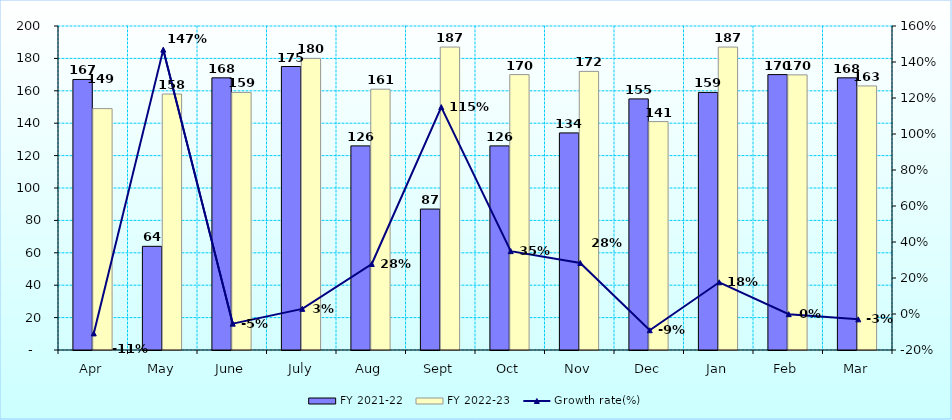
| Category | FY 2021-22 | FY 2022-23 |
|---|---|---|
| Apr | 167 | 149 |
| May | 64 | 158 |
| June | 168 | 159 |
| July | 175 | 180 |
| Aug | 126 | 161 |
| Sept | 87 | 187 |
| Oct | 126 | 170 |
| Nov | 134 | 172 |
| Dec | 155 | 141 |
| Jan | 159 | 187 |
| Feb | 170 | 169.826 |
| Mar | 168 | 163 |